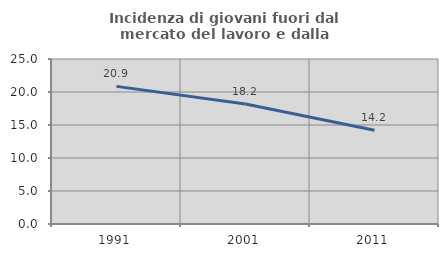
| Category | Incidenza di giovani fuori dal mercato del lavoro e dalla formazione  |
|---|---|
| 1991.0 | 20.851 |
| 2001.0 | 18.182 |
| 2011.0 | 14.208 |